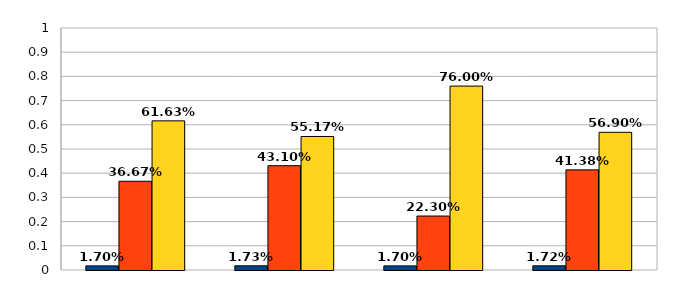
| Category | Series 0 | Series 1 | Series 2 |
|---|---|---|---|
| 0 | 0.017 | 0.367 | 0.616 |
| 1 | 0.017 | 0.431 | 0.552 |
| 2 | 0.017 | 0.223 | 0.76 |
| 3 | 0.017 | 0.414 | 0.569 |